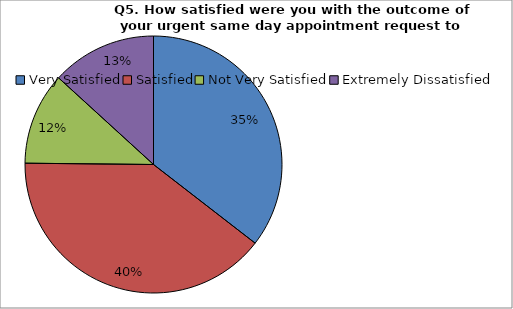
| Category | Series 0 |
|---|---|
| Very Satisfied | 110 |
| Satisfied | 123 |
| Not Very Satisfied | 36 |
| Extremely Dissatisfied | 41 |